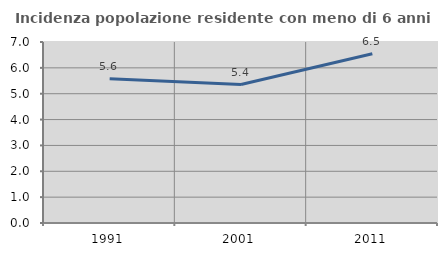
| Category | Incidenza popolazione residente con meno di 6 anni |
|---|---|
| 1991.0 | 5.583 |
| 2001.0 | 5.354 |
| 2011.0 | 6.544 |